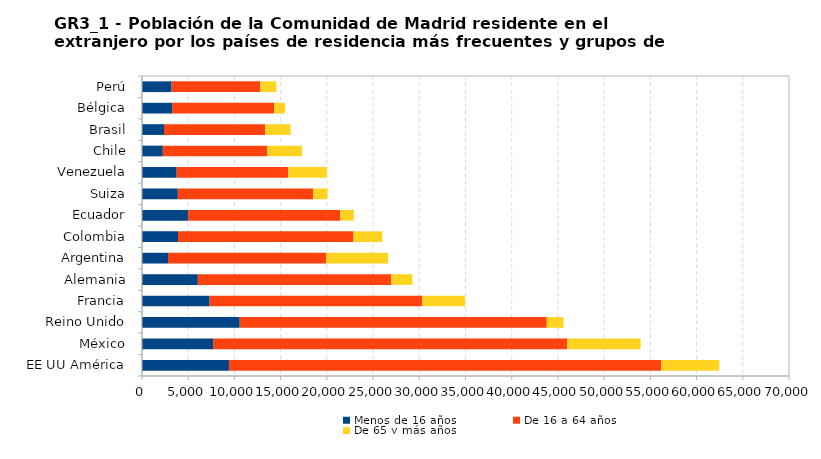
| Category | Menos de 16 años | De 16 a 64 años | De 65 y más años |
|---|---|---|---|
|     EE UU América | 9408 | 46780 | 6270 |
|     México | 7690 | 38318 | 7943 |
|     Reino Unido | 10576 | 33219 | 1792 |
|     Francia | 7313 | 23017 | 4612 |
|     Alemania | 6043 | 20929 | 2281 |
|     Argentina | 2812 | 17103 | 6710 |
|     Colombia | 3898 | 18984 | 3117 |
|     Ecuador | 4996 | 16451 | 1472 |
|     Suiza | 3877 | 14627 | 1555 |
|     Venezuela | 3757 | 12055 | 4184 |
|     Chile | 2254 | 11306 | 3757 |
|     Brasil | 2379 | 10941 | 2758 |
|     Bélgica | 3257 | 11041 | 1182 |
|     Perú | 3199 | 9596 | 1743 |